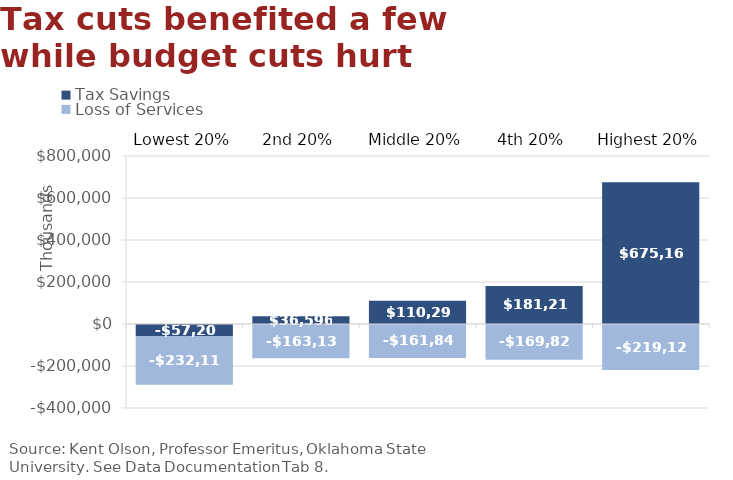
| Category | Tax Savings | Loss of Services |
|---|---|---|
| Lowest 20% | -57207.217 | -232116.511 |
| 2nd 20% | 36595.793 | -163136.515 |
| Middle 20% | 110292.149 | -161848.22 |
| 4th 20% | 181212.271 | -169826.313 |
| Highest 20% | 675161.054 | -219126.492 |